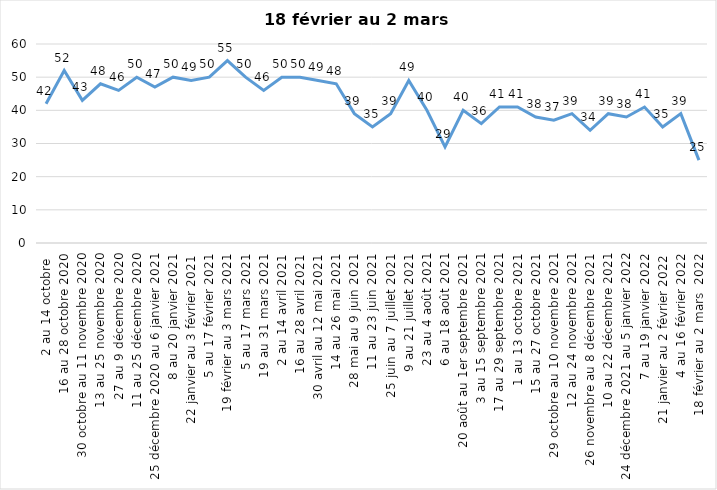
| Category | Toujours aux trois mesures |
|---|---|
| 2 au 14 octobre  | 42 |
| 16 au 28 octobre 2020 | 52 |
| 30 octobre au 11 novembre 2020 | 43 |
| 13 au 25 novembre 2020 | 48 |
| 27 au 9 décembre 2020 | 46 |
| 11 au 25 décembre 2020 | 50 |
| 25 décembre 2020 au 6 janvier 2021 | 47 |
| 8 au 20 janvier 2021 | 50 |
| 22 janvier au 3 février 2021 | 49 |
| 5 au 17 février 2021 | 50 |
| 19 février au 3 mars 2021 | 55 |
| 5 au 17 mars 2021 | 50 |
| 19 au 31 mars 2021 | 46 |
| 2 au 14 avril 2021 | 50 |
| 16 au 28 avril 2021 | 50 |
| 30 avril au 12 mai 2021 | 49 |
| 14 au 26 mai 2021 | 48 |
| 28 mai au 9 juin 2021 | 39 |
| 11 au 23 juin 2021 | 35 |
| 25 juin au 7 juillet 2021 | 39 |
| 9 au 21 juillet 2021 | 49 |
| 23 au 4 août 2021 | 40 |
| 6 au 18 août 2021 | 29 |
| 20 août au 1er septembre 2021 | 40 |
| 3 au 15 septembre 2021 | 36 |
| 17 au 29 septembre 2021 | 41 |
| 1 au 13 octobre 2021 | 41 |
| 15 au 27 octobre 2021 | 38 |
| 29 octobre au 10 novembre 2021 | 37 |
| 12 au 24 novembre 2021 | 39 |
| 26 novembre au 8 décembre 2021 | 34 |
| 10 au 22 décembre 2021 | 39 |
| 24 décembre 2021 au 5 janvier 2022 | 38 |
| 7 au 19 janvier 2022 | 41 |
| 21 janvier au 2 février 2022 | 35 |
| 4 au 16 février 2022 | 39 |
| 18 février au 2 mars  2022 | 25 |